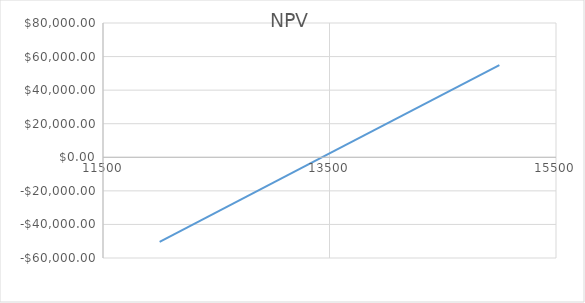
| Category | NPV |
|---|---|
| 12000.0 | -50365.821 |
| 13500.0 | 2263.311 |
| 15000.0 | 54892.442 |